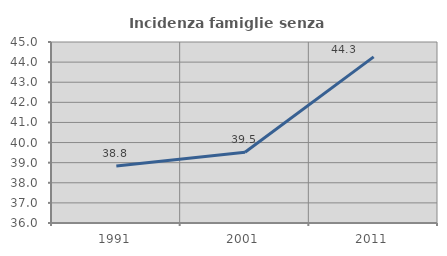
| Category | Incidenza famiglie senza nuclei |
|---|---|
| 1991.0 | 38.834 |
| 2001.0 | 39.517 |
| 2011.0 | 44.26 |